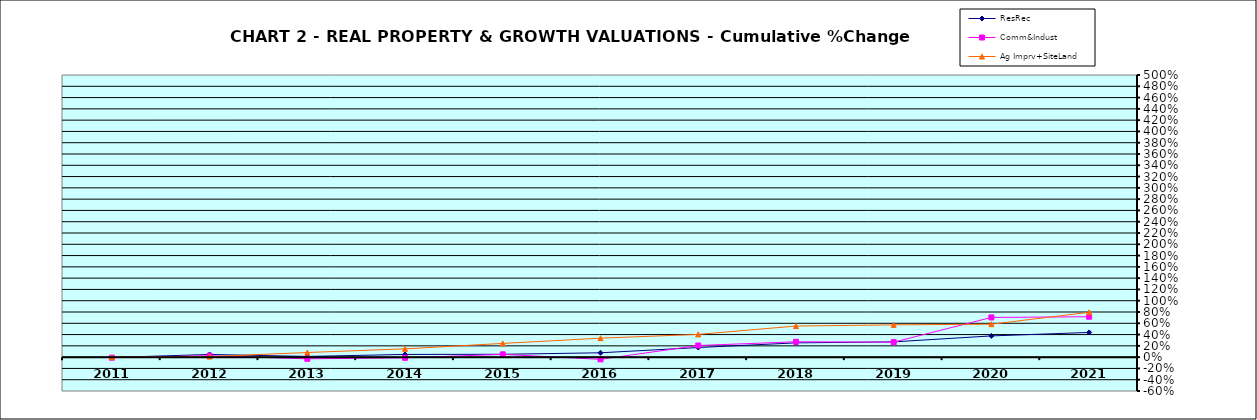
| Category | ResRec | Comm&Indust | Ag Imprv+SiteLand |
|---|---|---|---|
| 2011.0 | -0.006 | -0.01 | 0 |
| 2012.0 | 0.047 | 0.025 | 0.009 |
| 2013.0 | 0.012 | -0.029 | 0.082 |
| 2014.0 | 0.048 | -0.012 | 0.147 |
| 2015.0 | 0.05 | 0.049 | 0.244 |
| 2016.0 | 0.077 | -0.039 | 0.336 |
| 2017.0 | 0.17 | 0.206 | 0.403 |
| 2018.0 | 0.253 | 0.272 | 0.551 |
| 2019.0 | 0.271 | 0.266 | 0.572 |
| 2020.0 | 0.376 | 0.703 | 0.584 |
| 2021.0 | 0.438 | 0.716 | 0.795 |